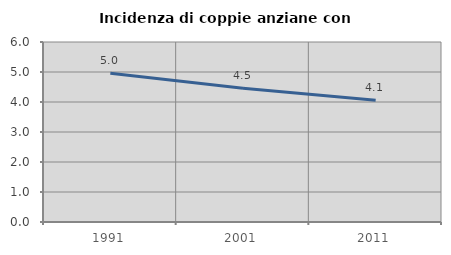
| Category | Incidenza di coppie anziane con figli |
|---|---|
| 1991.0 | 4.96 |
| 2001.0 | 4.455 |
| 2011.0 | 4.055 |